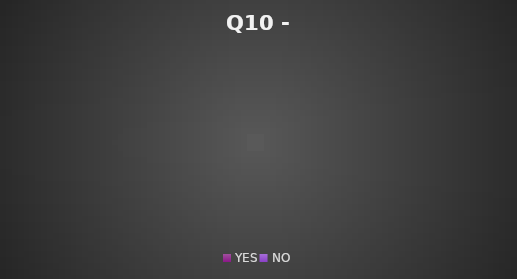
| Category | Series 0 |
|---|---|
| YES | 0 |
| NO | 0 |